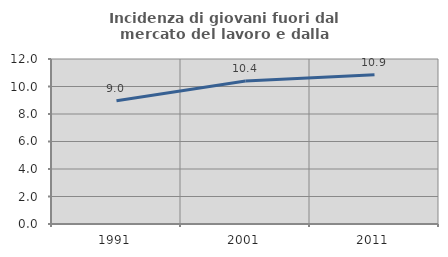
| Category | Incidenza di giovani fuori dal mercato del lavoro e dalla formazione  |
|---|---|
| 1991.0 | 8.97 |
| 2001.0 | 10.393 |
| 2011.0 | 10.855 |